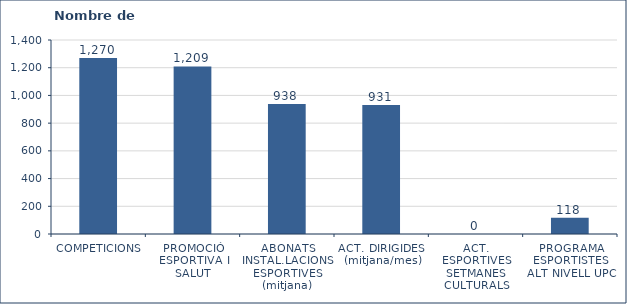
| Category | Nombre de participants |
|---|---|
| COMPETICIONS | 1270 |
| PROMOCIÓ ESPORTIVA I SALUT | 1209 |
| ABONATS INSTAL.LACIONS ESPORTIVES (mitjana) | 938 |
| ACT. DIRIGIDES  (mitjana/mes) | 931 |
| ACT. ESPORTIVES SETMANES CULTURALS | 0 |
| PROGRAMA ESPORTISTES ALT NIVELL UPC | 118 |